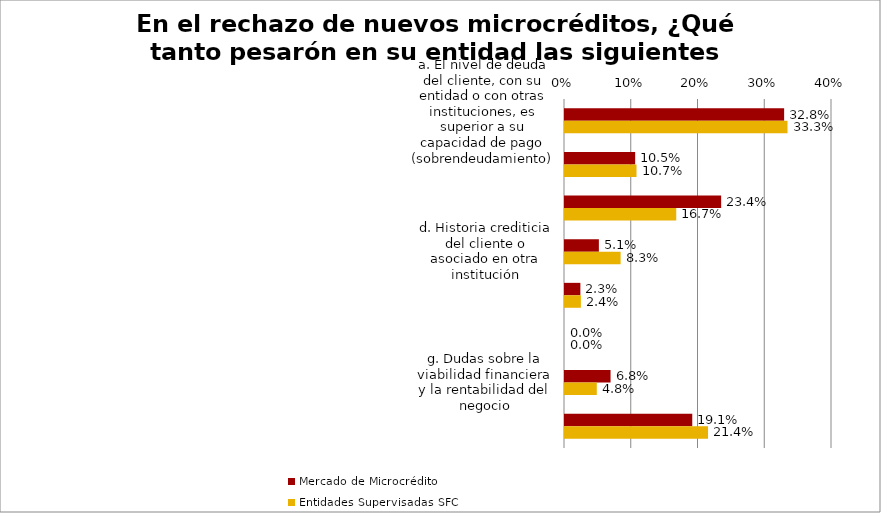
| Category | Mercado de Microcrédito | Entidades Supervisadas SFC |
|---|---|---|
| a. El nivel de deuda del cliente, con su entidad o con otras instituciones, es superior a su capacidad de pago (sobrendeudamiento) | 0.328 | 0.333 |
| b. Crédito con más de tres entidades | 0.105 | 0.107 |
| c. Mala historia crediticia | 0.234 | 0.167 |
| d. Historia crediticia del cliente o asociado en otra institución | 0.051 | 0.083 |
| e. Poco tiempo de creada la microempresa | 0.023 | 0.024 |
| f. Por sector productivo al cual pertenece el aplicante de crédito o del cual deriva sus principales fuentes de ingreso | 0 | 0 |
| g. Dudas sobre la viabilidad financiera y la rentabilidad del negocio | 0.068 | 0.048 |
| h. Capacidad de pago del cliente | 0.191 | 0.214 |